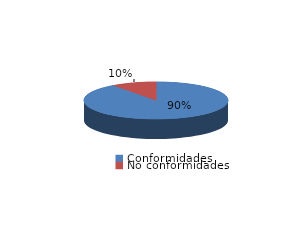
| Category | Series 0 |
|---|---|
| Conformidades | 938 |
| No conformidades | 105 |